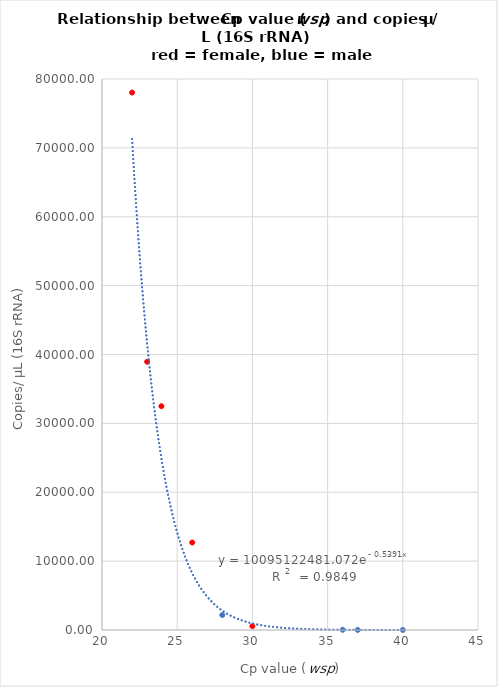
| Category | Series 0 |
|---|---|
| 37.0 | 12.691 |
| 36.0 | 32.144 |
| 40.0 | 9.539 |
| 28.0 | 2170.915 |
| 23.0 | 38945.02 |
| 23.95 | 32493.304 |
| 26.0 | 12702.484 |
| 30.0 | 553.591 |
| 22.0 | 78033.606 |